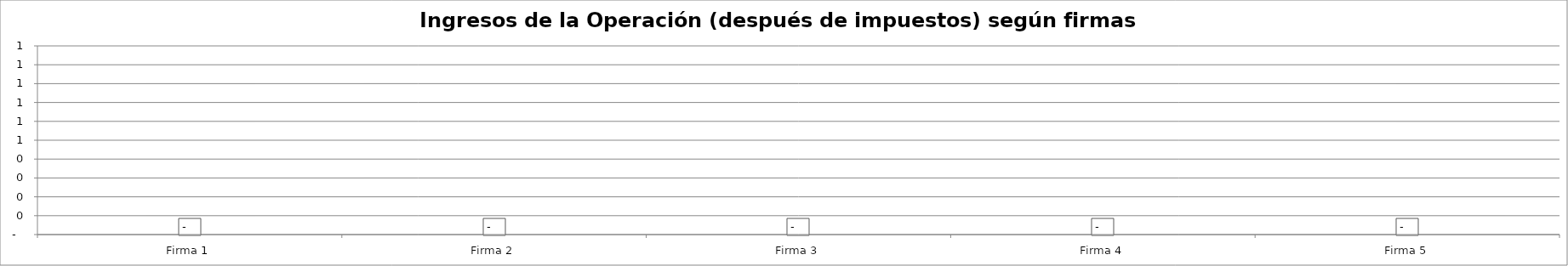
| Category | Ingresos de la Operación (después de impuestos) según firmas simuladas -Año 4 |
|---|---|
| Firma 1 | 0 |
| Firma 2 | 0 |
| Firma 3 | 0 |
| Firma 4 | 0 |
| Firma 5 | 0 |